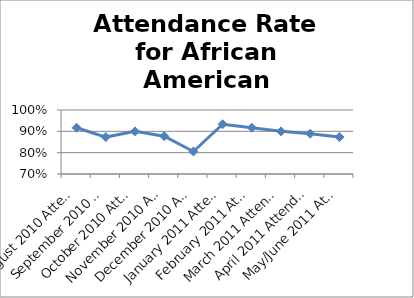
| Category | Attendance Rate for African Americans |
|---|---|
| August 2010 Attendance Rate | 0.917 |
| September 2010 Attendance Rate | 0.873 |
| October 2010 Attendance Rate | 0.9 |
| November 2010 Attendance Rate | 0.877 |
| December 2010 Attendance Rate | 0.806 |
| January 2011 Attendance Rate | 0.933 |
| February 2011 Attendance Rate | 0.917 |
| March 2011 Attendance Rate | 0.9 |
| April 2011 Attendance Rate | 0.889 |
| May/June 2011 Attendance Rate | 0.873 |